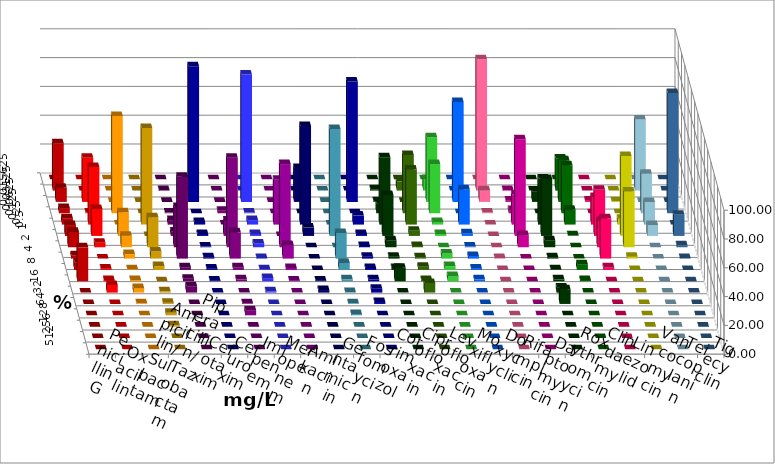
| Category | Penicillin G | Oxacillin | Ampicillin/ Sulbactam | Piperacillin/ Tazobactam | Cefotaxim | Cefuroxim | Imipenem | Meropenem | Amikacin | Gentamicin | Fosfomycin | Cotrimoxazol | Ciprofloxacin | Levofloxacin | Moxifloxacin | Doxycyclin | Rifampicin | Daptomycin | Roxythromycin | Clindamycin | Linezolid | Vancomycin | Teicoplanin | Tigecyclin |
|---|---|---|---|---|---|---|---|---|---|---|---|---|---|---|---|---|---|---|---|---|---|---|---|---|
| 0.015625 | 0 | 0 | 0 | 0 | 0 | 0 | 0 | 0 | 0 | 0 | 0 | 0 | 0 | 0 | 0 | 0 | 0 | 0 | 0 | 0 | 0 | 0 | 0 | 0 |
| 0.03125 | 32.889 | 0 | 0 | 0 | 0.444 | 0 | 0 | 0 | 0 | 0 | 0 | 0 | 0.889 | 6.222 | 8 | 0 | 91.111 | 0.444 | 0 | 22.222 | 0 | 0 | 0 | 49.327 |
| 0.0625 | 9.778 | 30.667 | 0 | 0 | 0 | 0 | 94.222 | 88.444 | 0 | 23.556 | 0 | 83.556 | 0.444 | 0 | 44.889 | 69.333 | 8 | 0.889 | 7.111 | 28.889 | 0.889 | 0.444 | 0 | 0 |
| 0.125 | 3.556 | 0.444 | 67.556 | 0 | 0.444 | 1.778 | 0 | 0.444 | 0 | 0 | 0 | 0 | 6.667 | 40.444 | 34.222 | 0 | 0.444 | 2.222 | 0 | 33.333 | 0 | 0 | 83.556 | 27.354 |
| 0.25 | 4.444 | 40 | 0 | 67.111 | 3.111 | 0 | 1.778 | 3.111 | 31.111 | 68.444 | 0 | 6.222 | 46.667 | 38.222 | 1.778 | 24.444 | 0 | 20.889 | 32 | 10.222 | 19.111 | 4 | 0 | 15.695 |
| 0.5 | 7.556 | 18.667 | 16.444 | 0 | 3.111 | 10.667 | 1.333 | 1.333 | 0 | 5.778 | 74.222 | 1.333 | 28.444 | 3.556 | 1.333 | 1.778 | 0 | 67.111 | 39.556 | 0.444 | 32 | 55.556 | 14.667 | 7.623 |
| 1.0 | 10.667 | 3.111 | 8 | 20.889 | 28 | 62.222 | 0.444 | 2.667 | 57.778 | 0 | 0 | 0.889 | 4.889 | 0.889 | 0 | 0.444 | 0 | 8.444 | 4.889 | 0 | 18.222 | 38.667 | 1.333 | 0 |
| 2.0 | 2.222 | 0 | 3.111 | 4.889 | 56.889 | 18.222 | 0.889 | 0.444 | 9.333 | 0 | 17.778 | 1.333 | 1.333 | 0.889 | 3.556 | 1.778 | 0.444 | 0 | 0.889 | 0 | 28 | 1.333 | 0.444 | 0 |
| 4.0 | 5.333 | 0.889 | 0.444 | 2.667 | 1.778 | 1.778 | 0.889 | 0.444 | 1.333 | 0 | 4.889 | 1.333 | 1.333 | 2.222 | 2.667 | 0.889 | 0 | 0 | 0.444 | 4 | 1.778 | 0 | 0 | 0 |
| 8.0 | 23.556 | 0.889 | 0.889 | 0 | 1.778 | 1.333 | 0.444 | 2.222 | 0.444 | 0.444 | 1.333 | 1.333 | 9.333 | 0.889 | 3.556 | 1.333 | 0 | 0 | 1.333 | 0.889 | 0 | 0 | 0 | 0 |
| 16.0 | 0 | 5.333 | 3.111 | 0.889 | 4.444 | 0 | 0 | 0.889 | 0 | 1.778 | 0.444 | 2.667 | 0 | 6.667 | 0 | 0 | 0 | 0 | 3.556 | 0 | 0 | 0 | 0 | 0 |
| 32.0 | 0 | 0 | 0.444 | 0.889 | 0 | 0.444 | 0 | 0 | 0 | 0 | 0.444 | 1.333 | 0 | 0 | 0 | 0 | 0 | 0 | 10.222 | 0 | 0 | 0 | 0 | 0 |
| 64.0 | 0 | 0 | 0 | 1.778 | 0 | 3.556 | 0 | 0 | 0 | 0 | 0.889 | 0 | 0 | 0 | 0 | 0 | 0 | 0 | 0 | 0 | 0 | 0 | 0 | 0 |
| 128.0 | 0 | 0 | 0 | 0.889 | 0 | 0 | 0 | 0 | 0 | 0 | 0 | 0 | 0 | 0 | 0 | 0 | 0 | 0 | 0 | 0 | 0 | 0 | 0 | 0 |
| 256.0 | 0 | 0 | 0 | 0 | 0 | 0 | 0 | 0 | 0 | 0 | 0 | 0 | 0 | 0 | 0 | 0 | 0 | 0 | 0 | 0 | 0 | 0 | 0 | 0 |
| 512.0 | 0 | 0 | 0 | 0 | 0 | 0 | 0 | 0 | 0 | 0 | 0 | 0 | 0 | 0 | 0 | 0 | 0 | 0 | 0 | 0 | 0 | 0 | 0 | 0 |